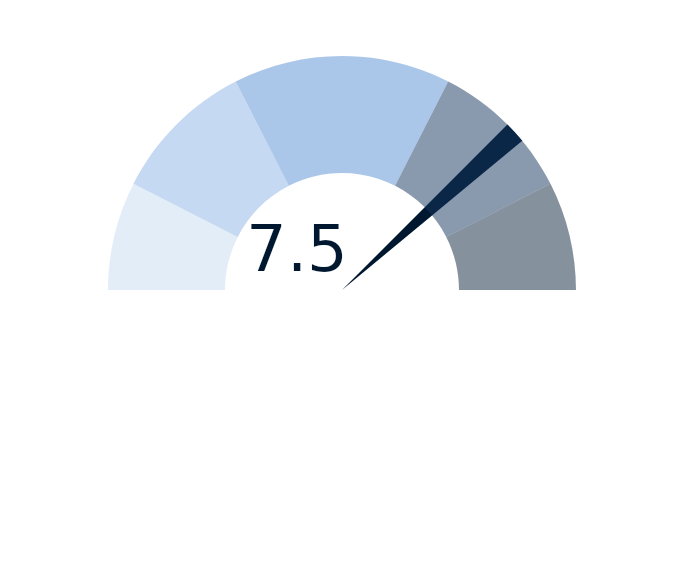
| Category | Series 2 |
|---|---|
| 0 | 7.5 |
| 1 | 0.3 |
| 2 | 12.2 |